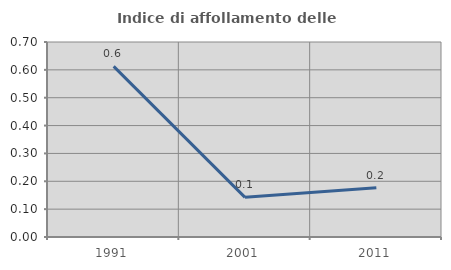
| Category | Indice di affollamento delle abitazioni  |
|---|---|
| 1991.0 | 0.612 |
| 2001.0 | 0.142 |
| 2011.0 | 0.177 |